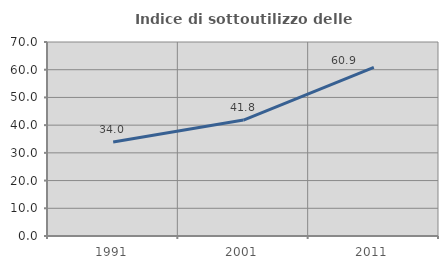
| Category | Indice di sottoutilizzo delle abitazioni  |
|---|---|
| 1991.0 | 33.953 |
| 2001.0 | 41.818 |
| 2011.0 | 60.87 |